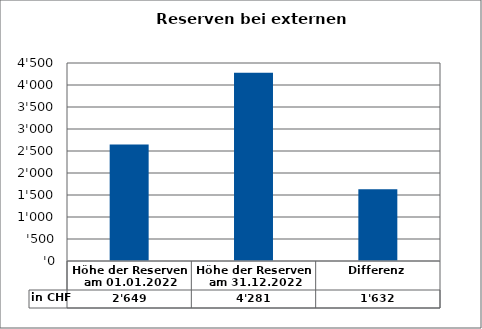
| Category | in CHF |
|---|---|
| Höhe der Reserven am 01.01.2022 | 2649 |
| Höhe der Reserven am 31.12.2022 | 4281 |
| Differenz | 1632 |